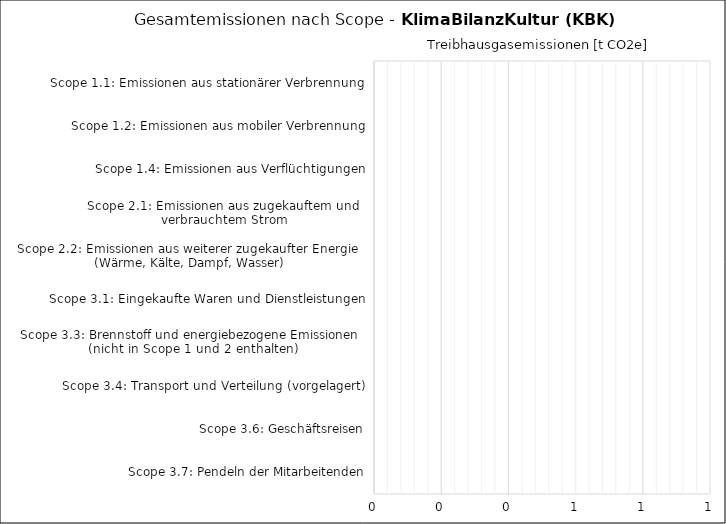
| Category | Series 1 |
|---|---|
| Scope 1.1: Emissionen aus stationärer Verbrennung | 0 |
| Scope 1.2: Emissionen aus mobiler Verbrennung | 0 |
| Scope 1.4: Emissionen aus Verflüchtigungen | 0 |
| Scope 2.1: Emissionen aus zugekauftem und 
verbrauchtem Strom | 0 |
| Scope 2.2: Emissionen aus weiterer zugekaufter Energie 
(Wärme, Kälte, Dampf, Wasser) | 0 |
| Scope 3.1: Eingekaufte Waren und Dienstleistungen | 0 |
| Scope 3.3: Brennstoff und energiebezogene Emissionen 
(nicht in Scope 1 und 2 enthalten) | 0 |
| Scope 3.4: Transport und Verteilung (vorgelagert) | 0 |
| Scope 3.6: Geschäftsreisen | 0 |
| Scope 3.7: Pendeln der Mitarbeitenden | 0 |